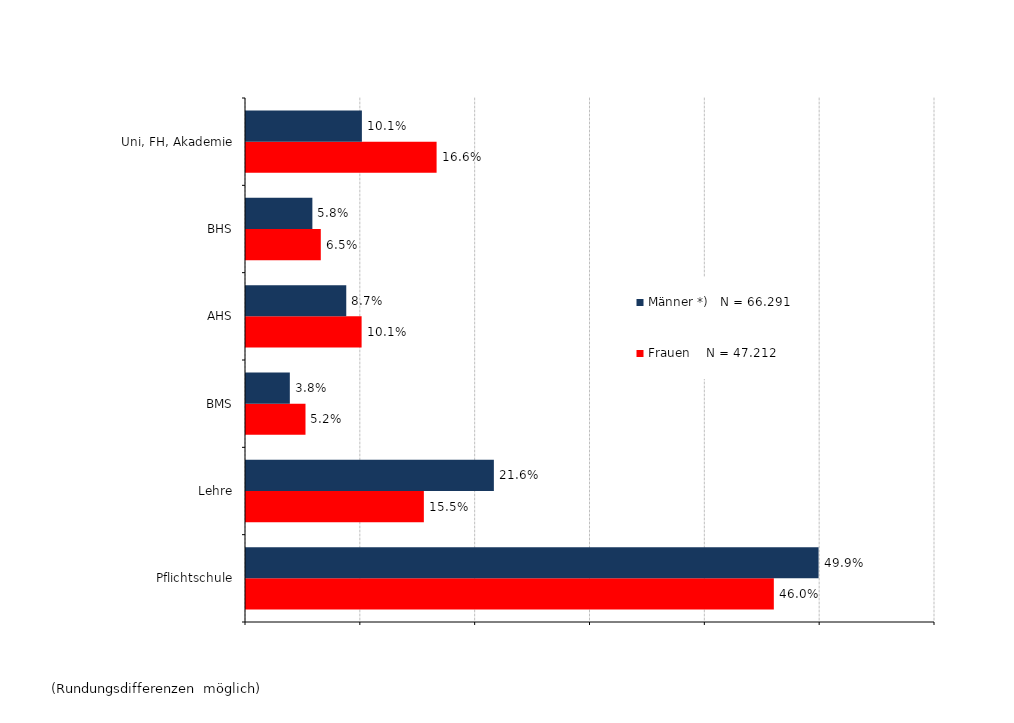
| Category | Frauen    N = 47.212 | Männer *)   N = 66.291 |
|---|---|---|
| Pflichtschule | 0.46 | 0.499 |
| Lehre | 0.155 | 0.216 |
| BMS | 0.052 | 0.038 |
| AHS | 0.101 | 0.087 |
| BHS | 0.065 | 0.058 |
| Uni, FH, Akademie | 0.166 | 0.101 |